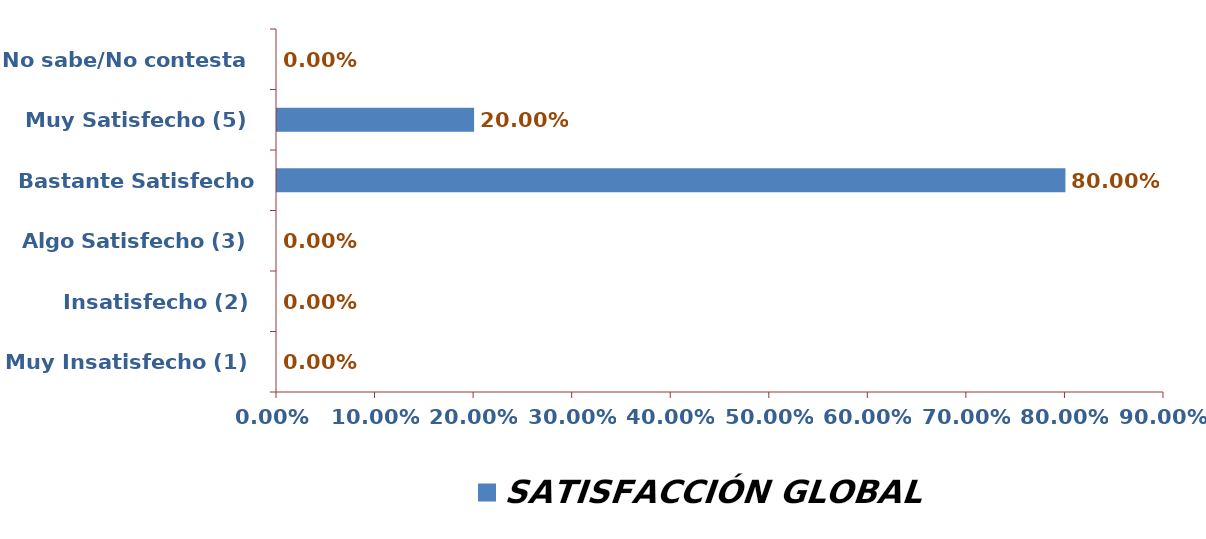
| Category | SATISFACCIÓN GLOBAL |
|---|---|
| Muy Insatisfecho (1) | 0 |
| Insatisfecho (2) | 0 |
| Algo Satisfecho (3) | 0 |
| Bastante Satisfecho (4) | 0.8 |
| Muy Satisfecho (5) | 0.2 |
| No sabe/No contesta | 0 |